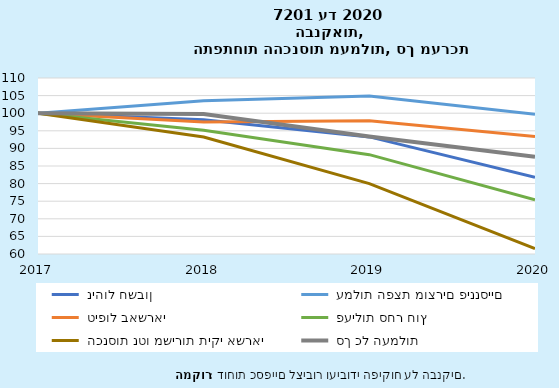
| Category |  ניהול חשבון |  עמלות הפצת מוצרים פיננסיים |  טיפול באשראי |  פעילות סחר חוץ |  הכנסות נטו משירות תיקי אשראי |  סך כל העמלות |
|---|---|---|---|---|---|---|
| 2017-12-31 | 100 | 100 | 100 | 100 | 100 | 100 |
| 2018-12-31 | 98.149 | 103.558 | 97.466 | 95.148 | 93.246 | 99.796 |
| 2019-12-31 | 93.268 | 104.905 | 97.866 | 88.224 | 79.995 | 93.371 |
| 2020-12-31 | 81.792 | 99.715 | 93.352 | 75.383 | 61.54 | 87.606 |